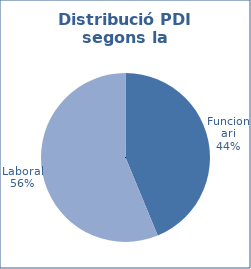
| Category | Series 0 |
|---|---|
| Funcionari | 1117 |
| Laboral | 1435 |